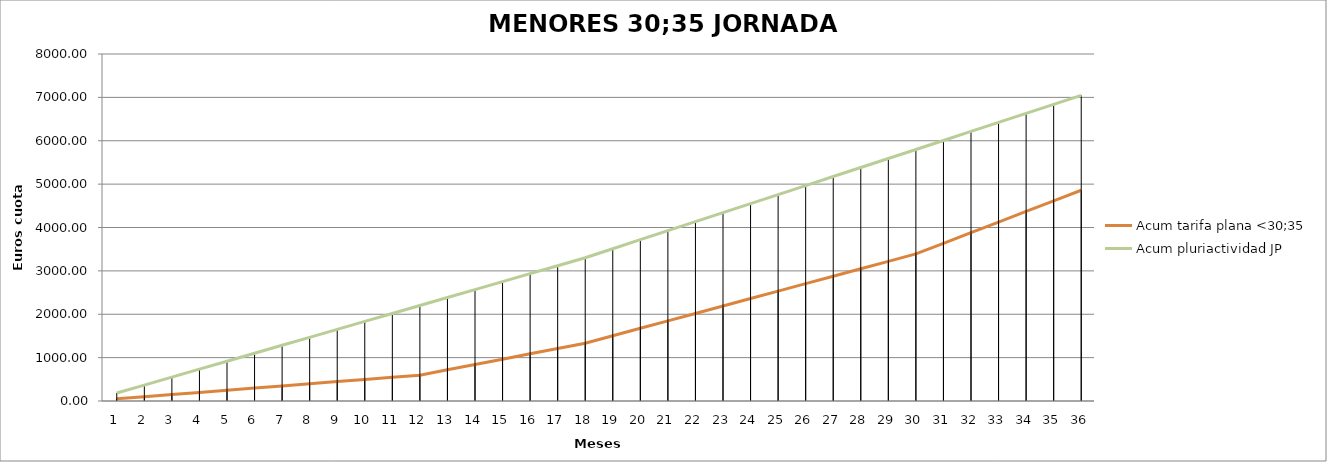
| Category | Acum tarifa plana <30;35 | Acum pluriactividad JP |
|---|---|---|
| 1.0 | 49.669 | 183.5 |
| 2.0 | 99.338 | 367 |
| 3.0 | 149.008 | 550.5 |
| 4.0 | 198.677 | 734 |
| 5.0 | 248.346 | 917.5 |
| 6.0 | 298.015 | 1101.001 |
| 7.0 | 347.684 | 1284.501 |
| 8.0 | 397.354 | 1468.001 |
| 9.0 | 447.023 | 1651.501 |
| 10.0 | 496.692 | 1835.001 |
| 11.0 | 546.361 | 2018.501 |
| 12.0 | 596.03 | 2202.001 |
| 13.0 | 718.824 | 2385.501 |
| 14.0 | 841.617 | 2569.001 |
| 15.0 | 964.41 | 2752.502 |
| 16.0 | 1087.204 | 2936.002 |
| 17.0 | 1209.997 | 3119.502 |
| 18.0 | 1332.79 | 3303.002 |
| 19.0 | 1504.333 | 3510.969 |
| 20.0 | 1675.876 | 3718.935 |
| 21.0 | 1847.418 | 3926.902 |
| 22.0 | 2018.961 | 4134.869 |
| 23.0 | 2190.504 | 4342.836 |
| 24.0 | 2362.046 | 4550.802 |
| 25.0 | 2533.589 | 4758.769 |
| 26.0 | 2705.132 | 4966.736 |
| 27.0 | 2876.674 | 5174.703 |
| 28.0 | 3048.217 | 5382.67 |
| 29.0 | 3219.76 | 5590.636 |
| 30.0 | 3391.303 | 5798.603 |
| 31.0 | 3635.969 | 6006.57 |
| 32.0 | 3880.636 | 6214.537 |
| 33.0 | 4125.303 | 6422.503 |
| 34.0 | 4369.97 | 6630.47 |
| 35.0 | 4614.637 | 6838.437 |
| 36.0 | 4859.303 | 7046.404 |